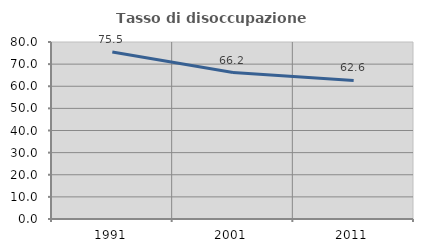
| Category | Tasso di disoccupazione giovanile  |
|---|---|
| 1991.0 | 75.49 |
| 2001.0 | 66.203 |
| 2011.0 | 62.623 |